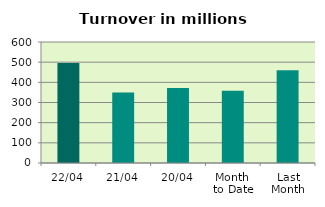
| Category | Series 0 |
|---|---|
| 22/04 | 495.848 |
| 21/04 | 349.036 |
| 20/04 | 371.783 |
| Month 
to Date | 358.432 |
| Last
Month | 459.546 |